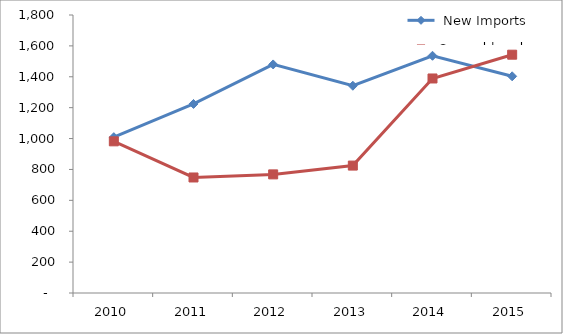
| Category |  New Imports | Second-hand Imports |
|---|---|---|
| 2010.0 | 1009 | 982 |
| 2011.0 | 1224 | 748 |
| 2012.0 | 1480 | 768 |
| 2013.0 | 1342 | 825 |
| 2014.0 | 1536 | 1389 |
| 2015.0 | 1403 | 1543 |